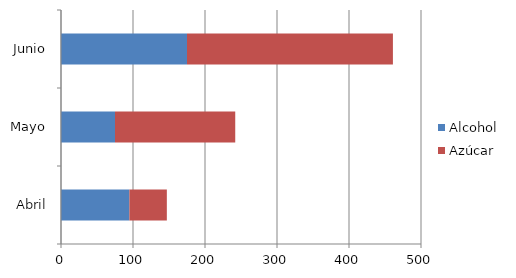
| Category | Alcohol | Azúcar |
|---|---|---|
| Abril | 95 | 52 |
| Mayo | 75 | 167 |
| Junio | 175 | 286 |